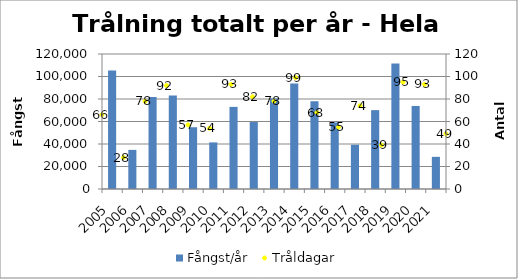
| Category | Fångst/år |
|---|---|
| 2005.0 | 105255 |
| 2006.0 | 34765 |
| 2007.0 | 81735 |
| 2008.0 | 83045 |
| 2009.0 | 54890 |
| 2010.0 | 41425 |
| 2011.0 | 72990 |
| 2012.0 | 59530 |
| 2013.0 | 80549 |
| 2014.0 | 93733 |
| 2015.0 | 78021 |
| 2016.0 | 59096 |
| 2017.0 | 39336 |
| 2018.0 | 70110 |
| 2019.0 | 111535 |
| 2020.0 | 73812 |
| 2021.0 | 28585 |